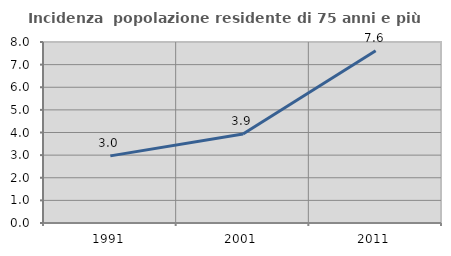
| Category | Incidenza  popolazione residente di 75 anni e più |
|---|---|
| 1991.0 | 2.967 |
| 2001.0 | 3.938 |
| 2011.0 | 7.617 |